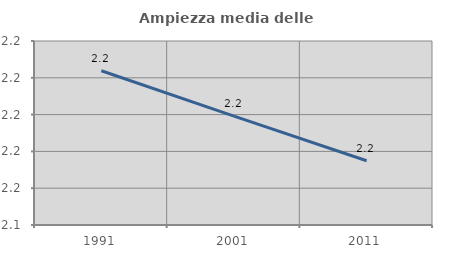
| Category | Ampiezza media delle famiglie |
|---|---|
| 1991.0 | 2.224 |
| 2001.0 | 2.199 |
| 2011.0 | 2.175 |